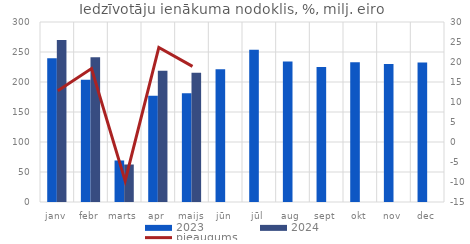
| Category | 2023 | 2024 |
|---|---|---|
| janv | 239.534 | 270.152 |
| febr | 203.945 | 241.398 |
| marts | 69.21 | 62.493 |
| apr | 176.948 | 218.77 |
| maijs | 181.073 | 215.29 |
| jūn | 221.435 | 0 |
| jūl | 253.867 | 0 |
| aug | 234.132 | 0 |
| sept | 225.118 | 0 |
| okt | 233.046 | 0 |
| nov | 229.983 | 0 |
| dec | 232.44 | 0 |